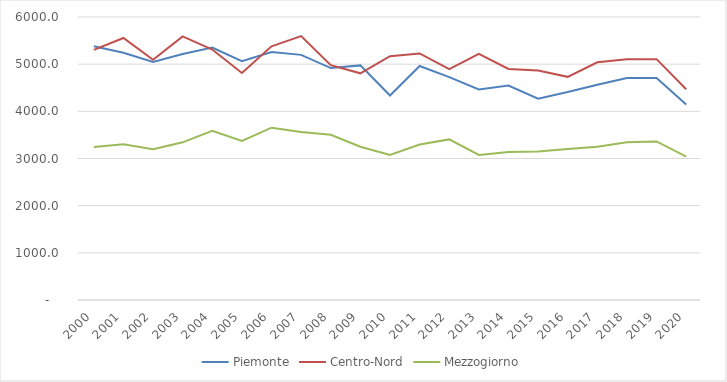
| Category | Piemonte | Centro-Nord | Mezzogiorno |
|---|---|---|---|
| 2000 | 5378.344 | 5303.099 | 3242.539 |
| 2001 | 5242.849 | 5555.188 | 3301.082 |
| 2002 | 5047.482 | 5093.456 | 3196.05 |
| 2003 | 5215.577 | 5589.534 | 3343.205 |
| 2004 | 5351.754 | 5310.196 | 3588.187 |
| 2005 | 5064.675 | 4812.011 | 3373 |
| 2006 | 5258.581 | 5377.561 | 3653.861 |
| 2007 | 5197.106 | 5593.926 | 3562.185 |
| 2008 | 4917.42 | 4978.764 | 3504.568 |
| 2009 | 4973.686 | 4805.664 | 3248.521 |
| 2010 | 4335.446 | 5168.295 | 3077.348 |
| 2011 | 4961.319 | 5226.591 | 3295.992 |
| 2012 | 4726.617 | 4895.357 | 3405.154 |
| 2013 | 4463.002 | 5220.788 | 3075.389 |
| 2014 | 4546.527 | 4899.529 | 3138.152 |
| 2015 | 4269.743 | 4863.371 | 3149.281 |
| 2016 | 4408.093 | 4731.233 | 3200.326 |
| 2017 | 4562.254 | 5039.888 | 3249.722 |
| 2018 | 4706.445 | 5103.553 | 3343.097 |
| 2019 | 4708.531 | 5106.136 | 3362.242 |
| 2020 | 4146.418 | 4469 | 3041.217 |